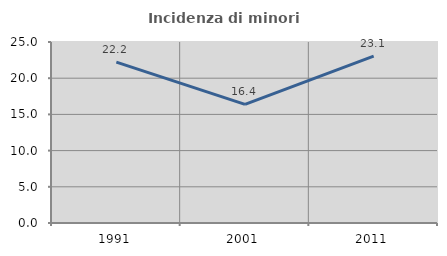
| Category | Incidenza di minori stranieri |
|---|---|
| 1991.0 | 22.222 |
| 2001.0 | 16.393 |
| 2011.0 | 23.061 |